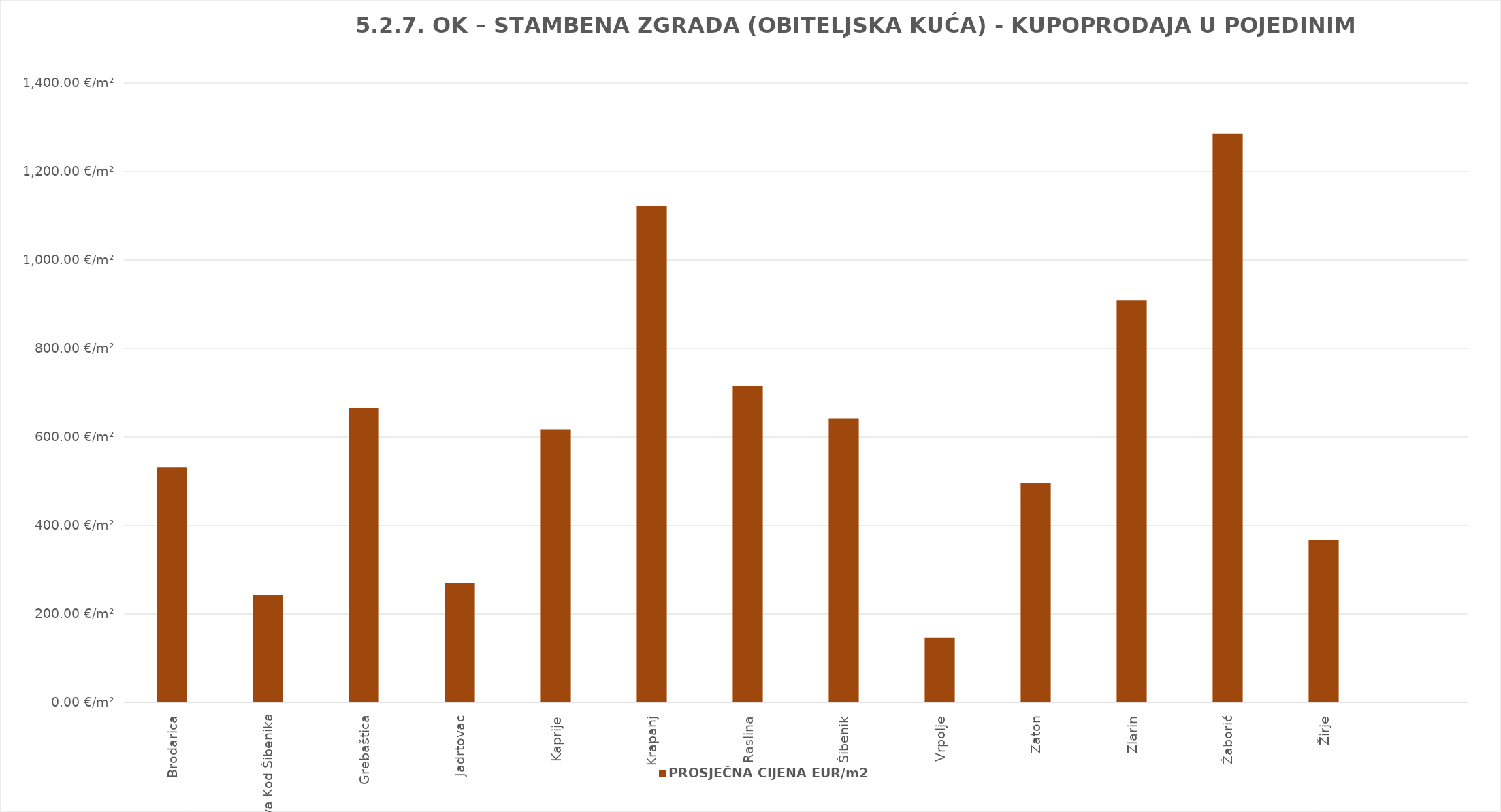
| Category | PROSJEČNA CIJENA EUR/m2 |
|---|---|
| Brodarica | 1901-06-14 19:27:56 |
| Dubrava Kod Šibenika | 1900-08-30 00:27:12 |
| Grebaštica | 1901-10-25 12:02:48 |
| Jadrtovac | 1900-09-25 23:37:56 |
| Kaprije | 1901-09-07 05:01:56 |
| Krapanj | 1903-01-25 23:42:39 |
| Raslina | 1901-12-15 09:02:59 |
| Šibenik | 1901-10-03 05:46:42 |
| Vrpolje | 1900-05-25 15:07:03 |
| Zaton | 1901-05-09 18:07:41 |
| Zlarin | 1902-06-26 20:08:49 |
| Žaborić | 1903-07-08 03:15:57 |
| Žirje | 1900-12-31 04:03:35 |